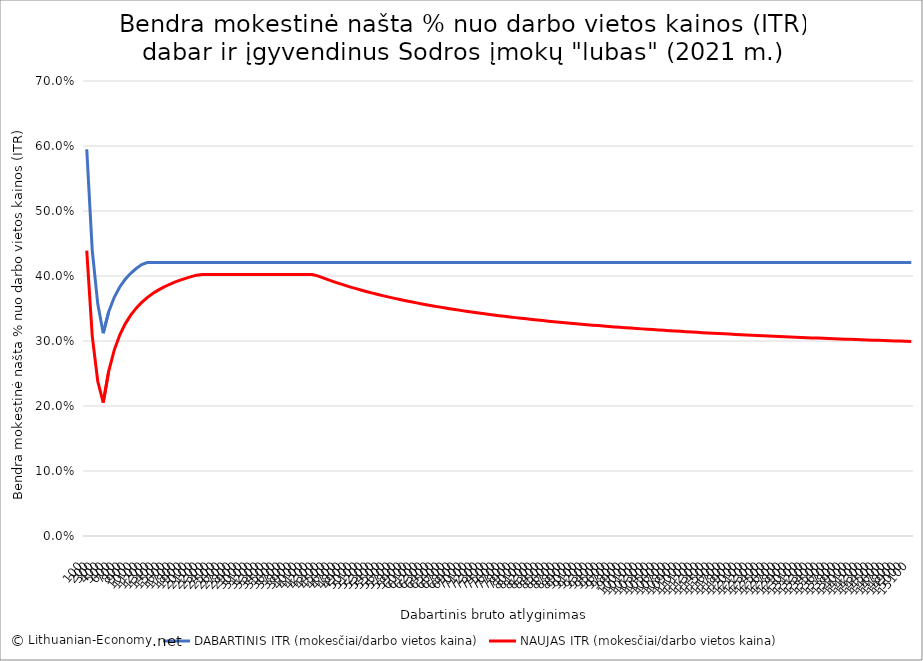
| Category | DABARTINIS ITR (mokesčiai/darbo vietos kaina) | NAUJAS ITR (mokesčiai/darbo vietos kaina) |
|---|---|---|
| 100.0 | 0.595 | 0.439 |
| 200.0 | 0.44 | 0.308 |
| 300.0 | 0.357 | 0.238 |
| 400.0 | 0.312 | 0.205 |
| 500.0 | 0.345 | 0.254 |
| 600.0 | 0.367 | 0.286 |
| 700.0 | 0.383 | 0.309 |
| 800.0 | 0.395 | 0.326 |
| 900.0 | 0.404 | 0.34 |
| 1000.0 | 0.411 | 0.351 |
| 1100.0 | 0.418 | 0.359 |
| 1200.0 | 0.421 | 0.367 |
| 1300.0 | 0.421 | 0.373 |
| 1400.0 | 0.421 | 0.378 |
| 1500.0 | 0.421 | 0.383 |
| 1600.0 | 0.421 | 0.387 |
| 1700.0 | 0.421 | 0.39 |
| 1800.0 | 0.421 | 0.394 |
| 1900.0 | 0.421 | 0.396 |
| 2000.0 | 0.421 | 0.399 |
| 2100.0 | 0.421 | 0.401 |
| 2200.0 | 0.421 | 0.402 |
| 2300.0 | 0.421 | 0.402 |
| 2400.0 | 0.421 | 0.402 |
| 2500.0 | 0.421 | 0.402 |
| 2600.0 | 0.421 | 0.402 |
| 2700.0 | 0.421 | 0.402 |
| 2800.0 | 0.421 | 0.402 |
| 2900.0 | 0.421 | 0.402 |
| 3000.0 | 0.421 | 0.402 |
| 3100.0 | 0.421 | 0.402 |
| 3200.0 | 0.421 | 0.402 |
| 3300.0 | 0.421 | 0.402 |
| 3400.0 | 0.421 | 0.402 |
| 3500.0 | 0.421 | 0.402 |
| 3600.0 | 0.421 | 0.402 |
| 3700.0 | 0.421 | 0.402 |
| 3800.0 | 0.421 | 0.402 |
| 3900.0 | 0.421 | 0.402 |
| 4000.0 | 0.421 | 0.402 |
| 4100.0 | 0.421 | 0.402 |
| 4200.0 | 0.421 | 0.402 |
| 4300.0 | 0.421 | 0.4 |
| 4400.0 | 0.421 | 0.397 |
| 4500.0 | 0.421 | 0.394 |
| 4600.0 | 0.421 | 0.391 |
| 4700.0 | 0.421 | 0.388 |
| 4800.0 | 0.421 | 0.386 |
| 4900.0 | 0.421 | 0.383 |
| 5000.0 | 0.421 | 0.381 |
| 5100.0 | 0.421 | 0.378 |
| 5200.0 | 0.421 | 0.376 |
| 5300.0 | 0.421 | 0.374 |
| 5400.0 | 0.421 | 0.372 |
| 5500.0 | 0.421 | 0.369 |
| 5600.0 | 0.421 | 0.368 |
| 5700.0 | 0.421 | 0.366 |
| 5800.0 | 0.421 | 0.364 |
| 5900.0 | 0.421 | 0.362 |
| 6000.0 | 0.421 | 0.36 |
| 6100.0 | 0.421 | 0.359 |
| 6200.0 | 0.421 | 0.357 |
| 6300.0 | 0.421 | 0.355 |
| 6400.0 | 0.421 | 0.354 |
| 6500.0 | 0.421 | 0.353 |
| 6600.0 | 0.421 | 0.351 |
| 6700.0 | 0.421 | 0.35 |
| 6800.0 | 0.421 | 0.348 |
| 6900.0 | 0.421 | 0.347 |
| 7000.0 | 0.421 | 0.346 |
| 7100.0 | 0.421 | 0.345 |
| 7200.0 | 0.421 | 0.343 |
| 7300.0 | 0.421 | 0.342 |
| 7400.0 | 0.421 | 0.341 |
| 7500.0 | 0.421 | 0.34 |
| 7600.0 | 0.421 | 0.339 |
| 7700.0 | 0.421 | 0.338 |
| 7800.0 | 0.421 | 0.337 |
| 7900.0 | 0.421 | 0.336 |
| 8000.0 | 0.421 | 0.335 |
| 8100.0 | 0.421 | 0.334 |
| 8200.0 | 0.421 | 0.333 |
| 8300.0 | 0.421 | 0.332 |
| 8400.0 | 0.421 | 0.331 |
| 8500.0 | 0.421 | 0.331 |
| 8600.0 | 0.421 | 0.33 |
| 8700.0 | 0.421 | 0.329 |
| 8800.0 | 0.421 | 0.328 |
| 8900.0 | 0.421 | 0.327 |
| 9000.0 | 0.421 | 0.327 |
| 9100.0 | 0.421 | 0.326 |
| 9200.0 | 0.421 | 0.325 |
| 9300.0 | 0.421 | 0.324 |
| 9400.0 | 0.421 | 0.324 |
| 9500.0 | 0.421 | 0.323 |
| 9600.0 | 0.421 | 0.322 |
| 9700.0 | 0.421 | 0.322 |
| 9800.0 | 0.421 | 0.321 |
| 9900.0 | 0.421 | 0.32 |
| 10000.0 | 0.421 | 0.32 |
| 10100.0 | 0.421 | 0.319 |
| 10200.0 | 0.421 | 0.319 |
| 10300.0 | 0.421 | 0.318 |
| 10400.0 | 0.421 | 0.318 |
| 10500.0 | 0.421 | 0.317 |
| 10600.0 | 0.421 | 0.316 |
| 10700.0 | 0.421 | 0.316 |
| 10800.0 | 0.421 | 0.315 |
| 10900.0 | 0.421 | 0.315 |
| 11000.0 | 0.421 | 0.314 |
| 11100.0 | 0.421 | 0.314 |
| 11200.0 | 0.421 | 0.313 |
| 11300.0 | 0.421 | 0.313 |
| 11400.0 | 0.421 | 0.312 |
| 11500.0 | 0.421 | 0.312 |
| 11600.0 | 0.421 | 0.311 |
| 11700.0 | 0.421 | 0.311 |
| 11800.0 | 0.421 | 0.311 |
| 11900.0 | 0.421 | 0.31 |
| 12000.0 | 0.421 | 0.31 |
| 12100.0 | 0.421 | 0.309 |
| 12200.0 | 0.421 | 0.309 |
| 12300.0 | 0.421 | 0.309 |
| 12400.0 | 0.421 | 0.308 |
| 12500.0 | 0.421 | 0.308 |
| 12600.0 | 0.421 | 0.307 |
| 12700.0 | 0.421 | 0.307 |
| 12800.0 | 0.421 | 0.307 |
| 12900.0 | 0.421 | 0.306 |
| 13000.0 | 0.421 | 0.306 |
| 13100.0 | 0.421 | 0.305 |
| 13200.0 | 0.421 | 0.305 |
| 13300.0 | 0.421 | 0.305 |
| 13400.0 | 0.421 | 0.304 |
| 13500.0 | 0.421 | 0.304 |
| 13600.0 | 0.421 | 0.304 |
| 13700.0 | 0.421 | 0.303 |
| 13800.0 | 0.421 | 0.303 |
| 13900.0 | 0.421 | 0.303 |
| 14000.0 | 0.421 | 0.303 |
| 14100.0 | 0.421 | 0.302 |
| 14200.0 | 0.421 | 0.302 |
| 14300.0 | 0.421 | 0.302 |
| 14400.0 | 0.421 | 0.301 |
| 14500.0 | 0.421 | 0.301 |
| 14600.0 | 0.421 | 0.301 |
| 14700.0 | 0.421 | 0.3 |
| 14800.0 | 0.421 | 0.3 |
| 14900.0 | 0.421 | 0.3 |
| 15000.0 | 0.421 | 0.3 |
| 15100.0 | 0.421 | 0.299 |